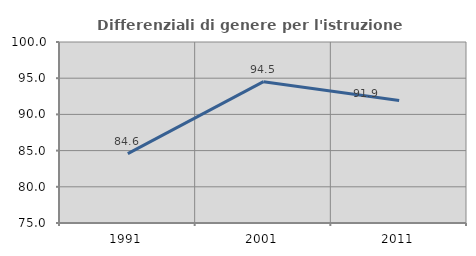
| Category | Differenziali di genere per l'istruzione superiore |
|---|---|
| 1991.0 | 84.572 |
| 2001.0 | 94.519 |
| 2011.0 | 91.905 |